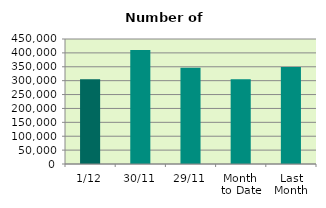
| Category | Series 0 |
|---|---|
| 1/12 | 305268 |
| 30/11 | 410374 |
| 29/11 | 346194 |
| Month 
to Date | 305268 |
| Last
Month | 349295 |